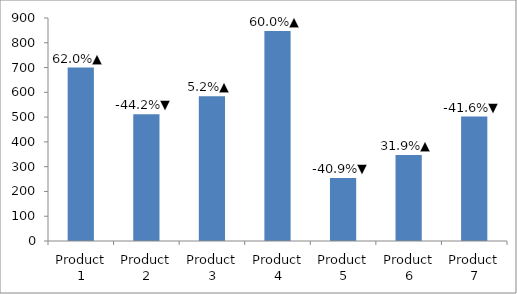
| Category | Series 0 |
|---|---|
| Product 1 | 700 |
| Product 2 | 512 |
| Product 3 | 584 |
| Product 4 | 848 |
| Product 5 | 254 |
| Product 6 | 347 |
| Product 7 | 502 |